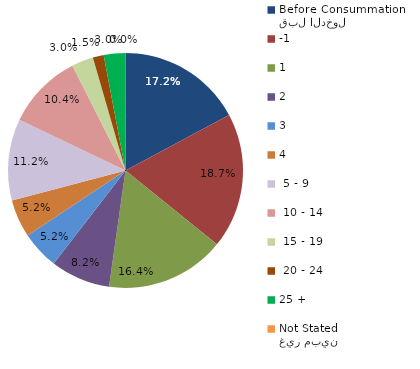
| Category | Series 0 |
|---|---|
| قبل الدخول
Before Consummation | 17.164 |
| -1 | 18.657 |
| 1 | 16.418 |
| 2 | 8.209 |
| 3 | 5.224 |
| 4 | 5.224 |
|  5 - 9 | 11.194 |
|  10 - 14 | 10.448 |
|  15 - 19 | 2.985 |
|  20 - 24 | 1.493 |
| 25 + | 2.985 |
| غير مبين
Not Stated | 0 |